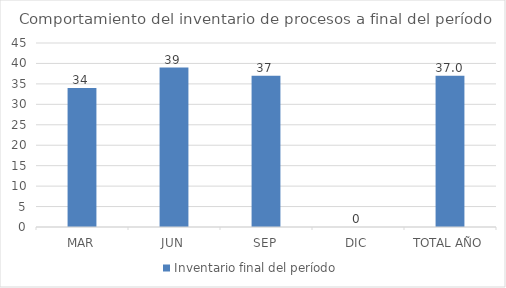
| Category | Inventario final del período |
|---|---|
| MAR | 34 |
| JUN | 39 |
| SEP | 37 |
| DIC | 0 |
| TOTAL AÑO | 37 |